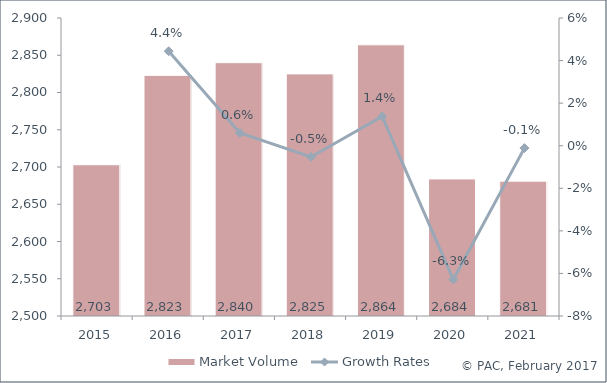
| Category | Market Volume |
|---|---|
| 2015.0 | 2703 |
| 2016.0 | 2823 |
| 2017.0 | 2840 |
| 2018.0 | 2825 |
| 2019.0 | 2864 |
| 2020.0 | 2684 |
| 2021.0 | 2681 |